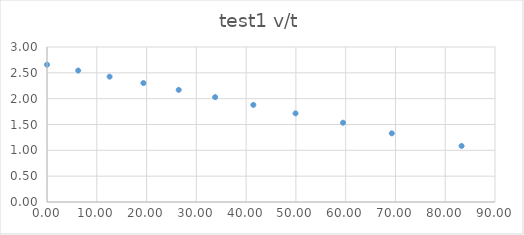
| Category | test1 v/t |
|---|---|
| 0.0 | 2.658 |
| 6.27 | 2.545 |
| 12.58 | 2.426 |
| 19.37 | 2.302 |
| 26.46 | 2.17 |
| 33.78 | 2.03 |
| 41.45 | 1.879 |
| 49.93 | 1.716 |
| 59.47 | 1.534 |
| 69.26 | 1.329 |
| 83.29 | 1.085 |